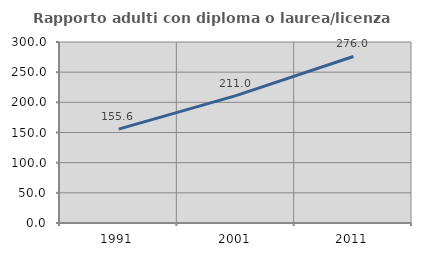
| Category | Rapporto adulti con diploma o laurea/licenza media  |
|---|---|
| 1991.0 | 155.556 |
| 2001.0 | 211.029 |
| 2011.0 | 275.969 |